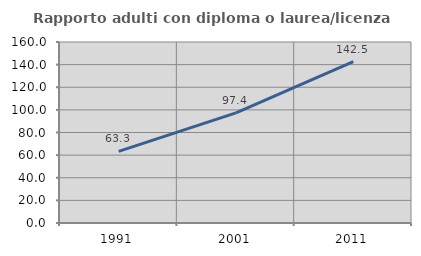
| Category | Rapporto adulti con diploma o laurea/licenza media  |
|---|---|
| 1991.0 | 63.333 |
| 2001.0 | 97.387 |
| 2011.0 | 142.549 |